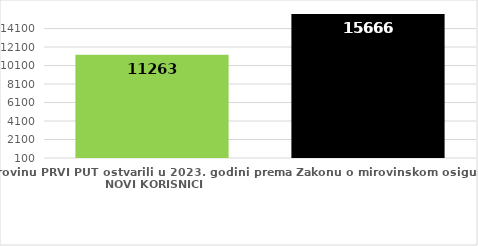
| Category | broj korisnika |
|---|---|
| Korisnici koji su pravo na mirovinu PRVI PUT ostvarili u 2023. godini prema Zakonu o mirovinskom osiguranju - NOVI KORISNICI | 11263 |
| Korisnici mirovina kojima je u 2023. godini PRESTALO PRAVO NA MIROVINU - uzrok smrt 
koji su pravo na mirovinu ostvarili prema Zakonu o mirovinskom osiguranju | 15666 |